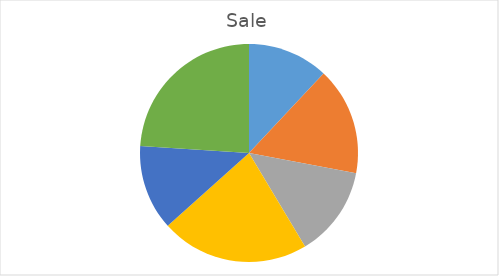
| Category | Sale |
|---|---|
| 1.0 | 150 |
| 2.0 | 200 |
| 3.0 | 168 |
| 4.0 | 275 |
| 5.0 | 158 |
| 6.0 | 300 |